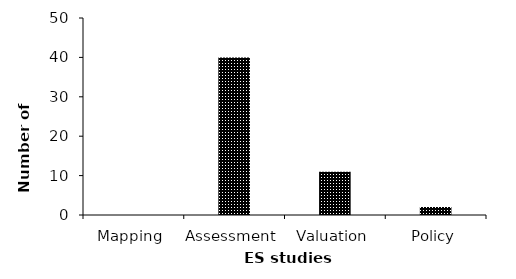
| Category | Series 0 |
|---|---|
| Mapping | 0 |
| Assessment | 40 |
| Valuation | 11 |
| Policy | 2 |